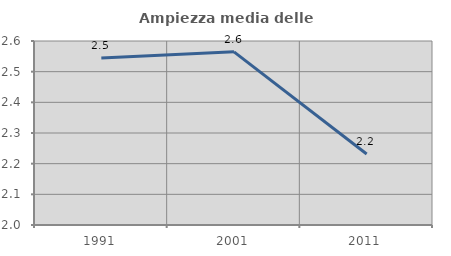
| Category | Ampiezza media delle famiglie |
|---|---|
| 1991.0 | 2.544 |
| 2001.0 | 2.565 |
| 2011.0 | 2.232 |